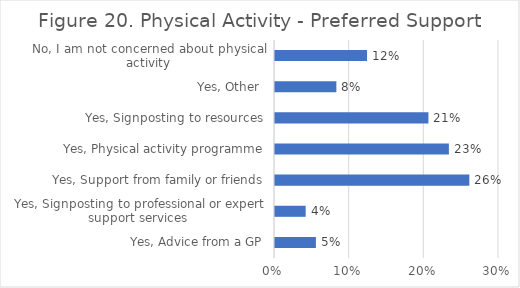
| Category | Series 0 |
|---|---|
| Yes, Advice from a GP | 0.055 |
| Yes, Signposting to professional or expert support services  | 0.041 |
| Yes, Support from family or friends | 0.26 |
| Yes, Physical activity programme | 0.233 |
| Yes, Signposting to resources | 0.205 |
| Yes, Other  | 0.082 |
| No, I am not concerned about physical activity | 0.123 |